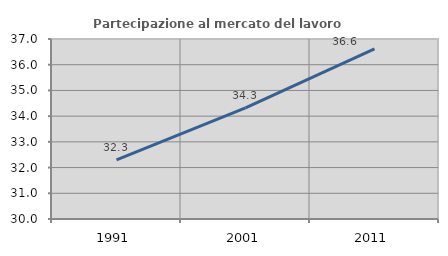
| Category | Partecipazione al mercato del lavoro  femminile |
|---|---|
| 1991.0 | 32.296 |
| 2001.0 | 34.323 |
| 2011.0 | 36.613 |